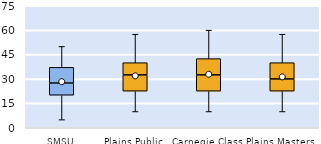
| Category | 25th | 50th | 75th |
|---|---|---|---|
| SMSU | 20 | 7.5 | 9.643 |
| Plains Public | 22.5 | 10 | 7.5 |
| Carnegie Class | 22.5 | 10 | 10 |
| Plains Masters | 22.5 | 7.5 | 10 |